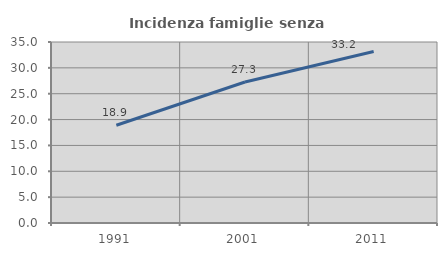
| Category | Incidenza famiglie senza nuclei |
|---|---|
| 1991.0 | 18.906 |
| 2001.0 | 27.274 |
| 2011.0 | 33.165 |